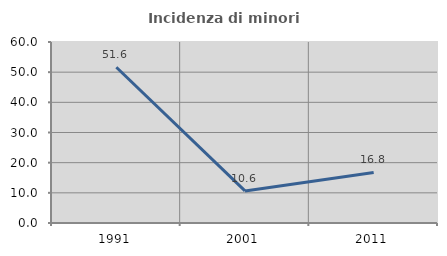
| Category | Incidenza di minori stranieri |
|---|---|
| 1991.0 | 51.631 |
| 2001.0 | 10.625 |
| 2011.0 | 16.772 |